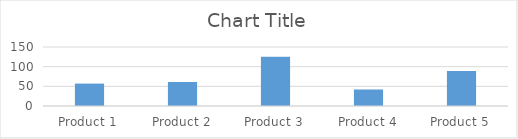
| Category | Series 0 |
|---|---|
| Product 1 | 57 |
| Product 2 | 61 |
| Product 3 | 125 |
| Product 4 | 42 |
| Product 5 | 89 |